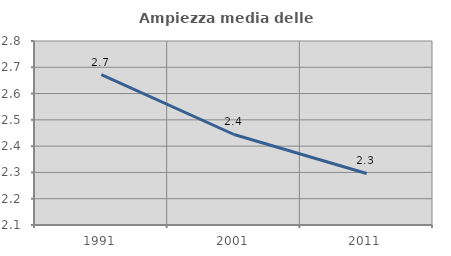
| Category | Ampiezza media delle famiglie |
|---|---|
| 1991.0 | 2.672 |
| 2001.0 | 2.444 |
| 2011.0 | 2.296 |